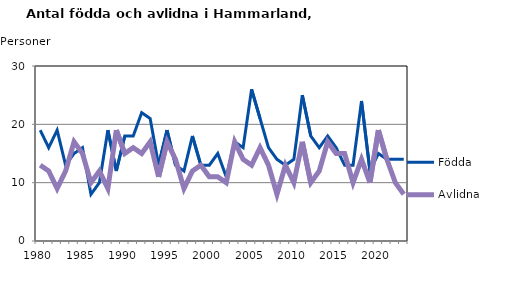
| Category | Födda | Avlidna |
|---|---|---|
| 1980.0 | 19 | 13 |
| 1981.0 | 16 | 12 |
| 1982.0 | 19 | 9 |
| 1983.0 | 13 | 12 |
| 1984.0 | 15 | 17 |
| 1985.0 | 16 | 15 |
| 1986.0 | 8 | 10 |
| 1987.0 | 10 | 12 |
| 1988.0 | 19 | 9 |
| 1989.0 | 12 | 19 |
| 1990.0 | 18 | 15 |
| 1991.0 | 18 | 16 |
| 1992.0 | 22 | 15 |
| 1993.0 | 21 | 17 |
| 1994.0 | 13 | 11 |
| 1995.0 | 19 | 17 |
| 1996.0 | 13 | 14 |
| 1997.0 | 12 | 9 |
| 1998.0 | 18 | 12 |
| 1999.0 | 13 | 13 |
| 2000.0 | 13 | 11 |
| 2001.0 | 15 | 11 |
| 2002.0 | 11 | 10 |
| 2003.0 | 17 | 17 |
| 2004.0 | 16 | 14 |
| 2005.0 | 26 | 13 |
| 2006.0 | 21 | 16 |
| 2007.0 | 16 | 13 |
| 2008.0 | 14 | 8 |
| 2009.0 | 13 | 13 |
| 2010.0 | 14 | 10 |
| 2011.0 | 25 | 17 |
| 2012.0 | 18 | 10 |
| 2013.0 | 16 | 12 |
| 2014.0 | 18 | 17 |
| 2015.0 | 16 | 15 |
| 2016.0 | 13 | 15 |
| 2017.0 | 13 | 10 |
| 2018.0 | 24 | 14 |
| 2019.0 | 12 | 10 |
| 2020.0 | 15 | 19 |
| 2021.0 | 14 | 14 |
| 2022.0 | 14 | 10 |
| 2023.0 | 14 | 8 |